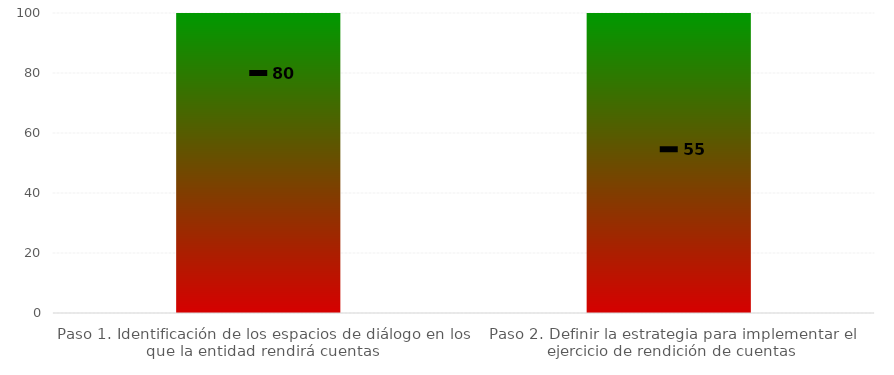
| Category | Niveles |
|---|---|
| Paso 1. Identificación de los espacios de diálogo en los que la entidad rendirá cuentas | 100 |
| Paso 2. Definir la estrategia para implementar el ejercicio de rendición de cuentas | 100 |